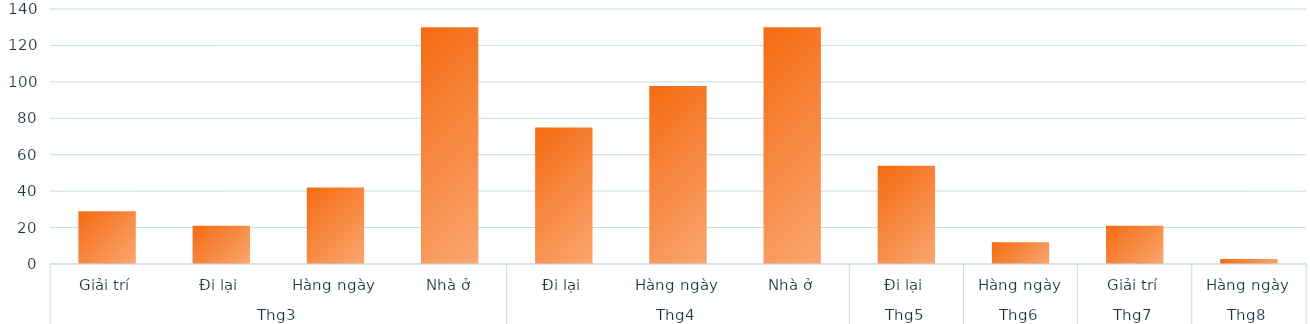
| Category | Tổng |
|---|---|
| 0 | 29 |
| 1 | 21 |
| 2 | 42 |
| 3 | 130 |
| 4 | 75 |
| 5 | 97.75 |
| 6 | 130 |
| 7 | 54 |
| 8 | 12 |
| 9 | 21 |
| 10 | 2.75 |